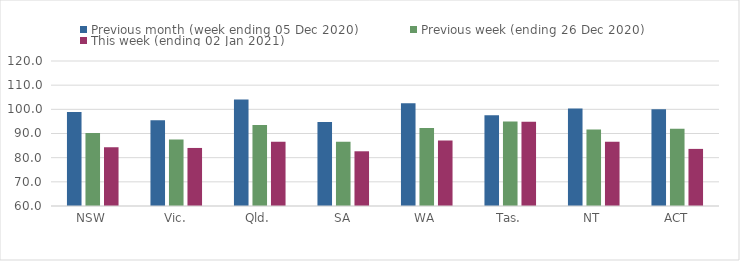
| Category | Previous month (week ending 05 Dec 2020) | Previous week (ending 26 Dec 2020) | This week (ending 02 Jan 2021) |
|---|---|---|---|
| NSW | 98.94 | 90.22 | 84.31 |
| Vic. | 95.44 | 87.56 | 84.02 |
| Qld. | 104.12 | 93.51 | 86.63 |
| SA | 94.71 | 86.54 | 82.64 |
| WA | 102.55 | 92.32 | 87.13 |
| Tas. | 97.57 | 94.95 | 94.82 |
| NT | 100.33 | 91.61 | 86.58 |
| ACT | 100 | 91.94 | 83.63 |